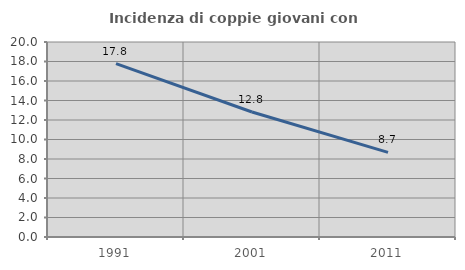
| Category | Incidenza di coppie giovani con figli |
|---|---|
| 1991.0 | 17.788 |
| 2001.0 | 12.821 |
| 2011.0 | 8.683 |